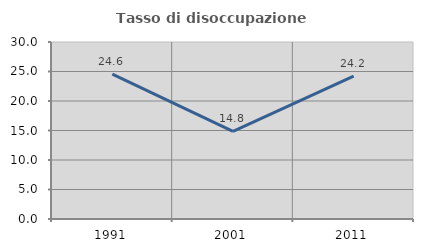
| Category | Tasso di disoccupazione giovanile  |
|---|---|
| 1991.0 | 24.567 |
| 2001.0 | 14.839 |
| 2011.0 | 24.211 |